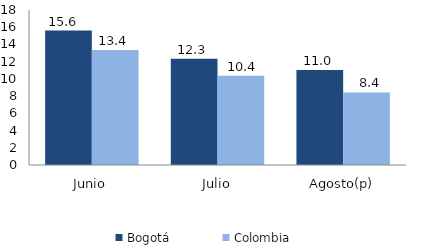
| Category | Bogotá | Colombia |
|---|---|---|
| Junio | 15.617 | 13.36 |
| Julio | 12.328 | 10.362 |
| Agosto(p) | 11.029 | 8.419 |